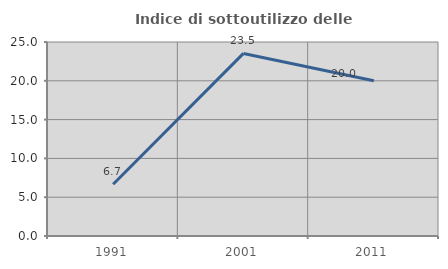
| Category | Indice di sottoutilizzo delle abitazioni  |
|---|---|
| 1991.0 | 6.667 |
| 2001.0 | 23.529 |
| 2011.0 | 20 |